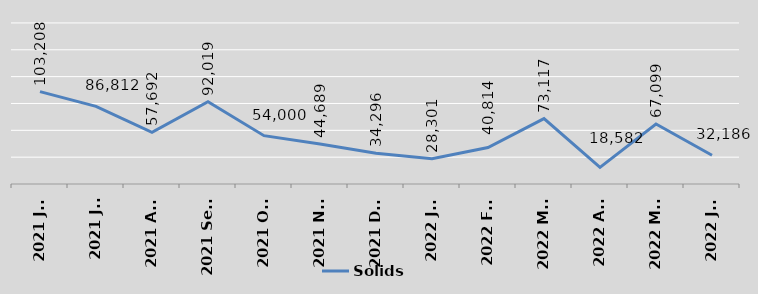
| Category | Solids |
|---|---|
| 2021 Jun | 103208 |
| 2021 Jul | 86812 |
| 2021 Aug | 57692 |
| 2021 Sept | 92019 |
| 2021 Oct | 54000 |
| 2021 Nov | 44689 |
| 2021 Dec | 34296 |
| 2022 Jan | 28301 |
| 2022 Feb | 40814 |
| 2022 Mar | 73117 |
| 2022 Apr | 18582 |
| 2022 May | 67099 |
| 2022 Jun | 32186 |